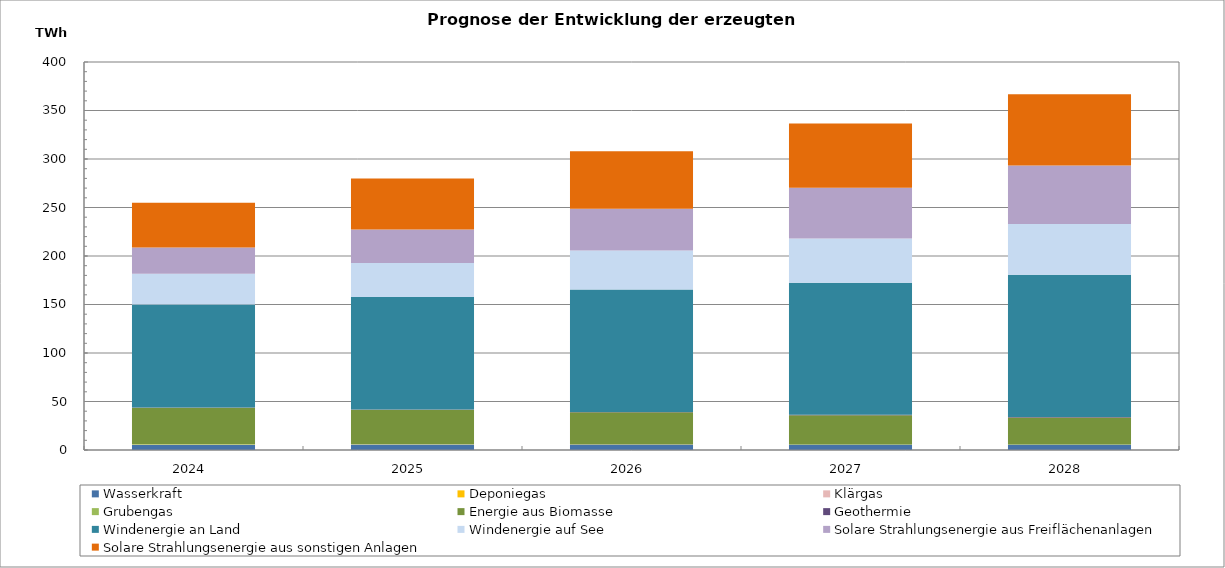
| Category | Wasserkraft | Deponiegas | Klärgas | Grubengas | Energie aus Biomasse | Geothermie | Windenergie an Land | Windenergie auf See | Solare Strahlungsenergie aus Freiflächenanlagen | Solare Strahlungsenergie aus sonstigen Anlagen |
|---|---|---|---|---|---|---|---|---|---|---|
| 2024.0 | 5395.092 | 174.603 | 66.467 | 481.382 | 37386.628 | 289.392 | 106290.322 | 31521.22 | 27166.384 | 46139.937 |
| 2025.0 | 5389.05 | 134.807 | 68.332 | 397.373 | 35537.408 | 339.173 | 115839.675 | 35161.027 | 34557.097 | 52531.387 |
| 2026.0 | 5383.008 | 97.161 | 70.197 | 232.551 | 33123.691 | 396.421 | 126133.111 | 40284.358 | 43071.129 | 59242.321 |
| 2027.0 | 5376.966 | 87.09 | 72.062 | 88.585 | 30266.099 | 462.256 | 136141.358 | 45585.057 | 52252.881 | 66264.423 |
| 2028.0 | 5370.924 | 80.065 | 73.927 | 19.915 | 27969.243 | 535.077 | 146703.245 | 52150.848 | 60394.561 | 73462.771 |